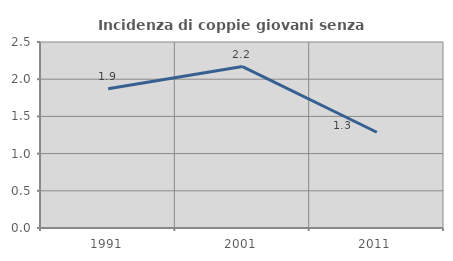
| Category | Incidenza di coppie giovani senza figli |
|---|---|
| 1991.0 | 1.871 |
| 2001.0 | 2.17 |
| 2011.0 | 1.287 |